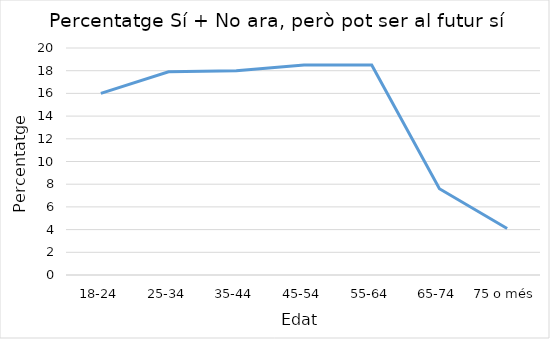
| Category | Series 0 |
|---|---|
| 18-24 | 16 |
| 25-34 | 17.9 |
| 35-44 | 18 |
| 45-54 | 18.5 |
| 55-64 | 18.5 |
| 65-74 | 7.6 |
| 75 o més | 4.1 |